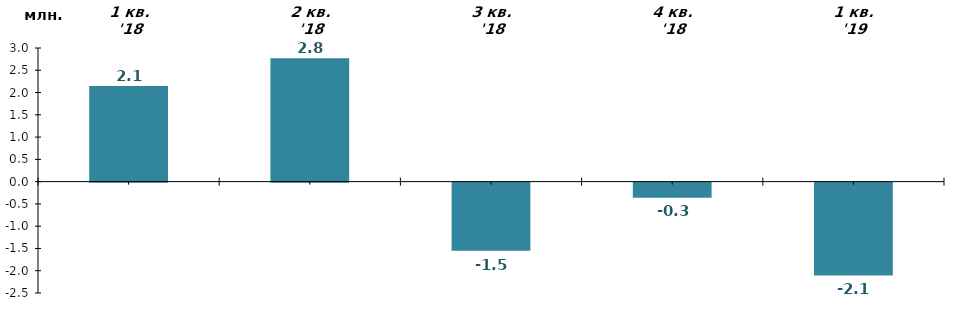
| Category | млн. грн. |
|---|---|
| 1 кв. '18 | 2.145 |
| 2 кв. '18 | 2.77 |
| 3 кв. '18 | -1.532 |
| 4 кв. '18 | -0.341 |
| 1 кв. '19 | -2.084 |